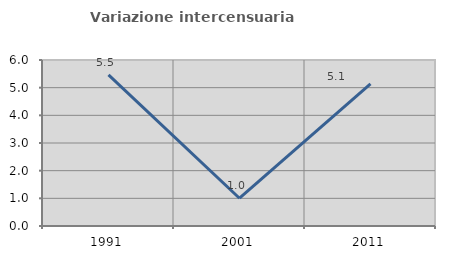
| Category | Variazione intercensuaria annua |
|---|---|
| 1991.0 | 5.461 |
| 2001.0 | 1.004 |
| 2011.0 | 5.138 |